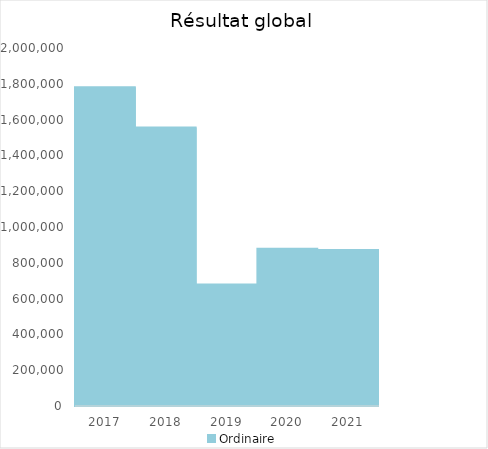
| Category |   | Ordinaire |    |
|---|---|---|---|
| 2017.0 |  | 1781031.72 |  |
| 2018.0 |  | 1555552.58 |  |
| 2019.0 |  | 678967.06 |  |
| 2020.0 |  | 878465.29 |  |
| 2021.0 |  | 870956.61 |  |